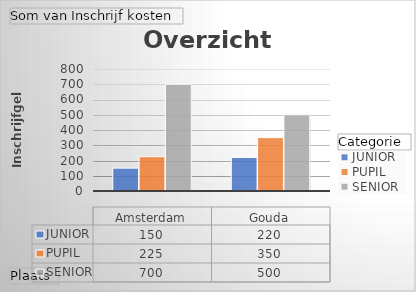
| Category | JUNIOR | PUPIL | SENIOR |
|---|---|---|---|
| Amsterdam | 150 | 225 | 700 |
| Gouda | 220 | 350 | 500 |